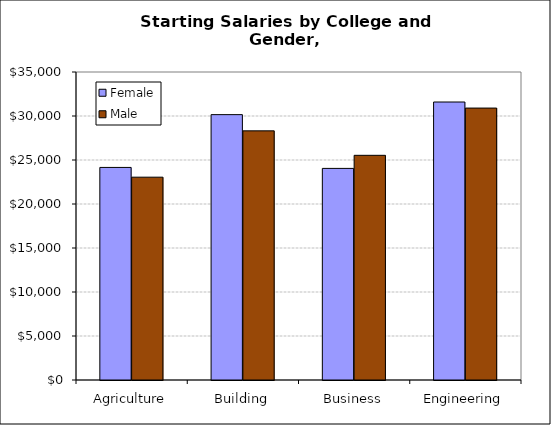
| Category | Female | Male |
|---|---|---|
| Agriculture | 24155.921 | 23047.34 |
| Building | 30154.87 | 28311.459 |
| Business | 24046.06 | 25532.517 |
| Engineering | 31590.361 | 30901.563 |